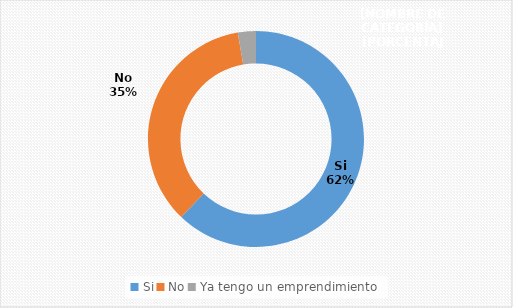
| Category | Series 0 |
|---|---|
| Si | 0.622 |
| No | 0.351 |
| Ya tengo un emprendimiento | 0.027 |